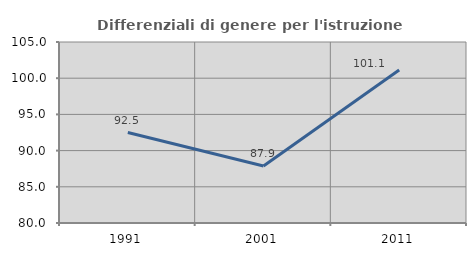
| Category | Differenziali di genere per l'istruzione superiore |
|---|---|
| 1991.0 | 92.492 |
| 2001.0 | 87.863 |
| 2011.0 | 101.123 |